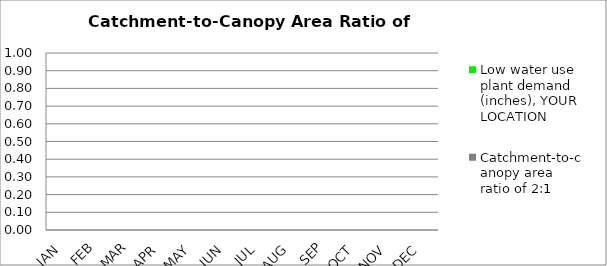
| Category | Low water use plant demand (inches), YOUR LOCATION | Catchment-to-canopy area ratio of 2:1  |
|---|---|---|
| JAN | 0 | 0 |
| FEB | 0 | 0 |
| MAR | 0 | 0 |
| APR | 0 | 0 |
| MAY | 0 | 0 |
| JUN | 0 | 0 |
| JUL | 0 | 0 |
| AUG | 0 | 0 |
| SEP | 0 | 0 |
| OCT | 0 | 0 |
| NOV | 0 | 0 |
| DEC | 0 | 0 |